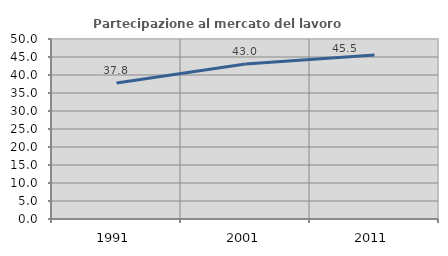
| Category | Partecipazione al mercato del lavoro  femminile |
|---|---|
| 1991.0 | 37.779 |
| 2001.0 | 43.045 |
| 2011.0 | 45.541 |